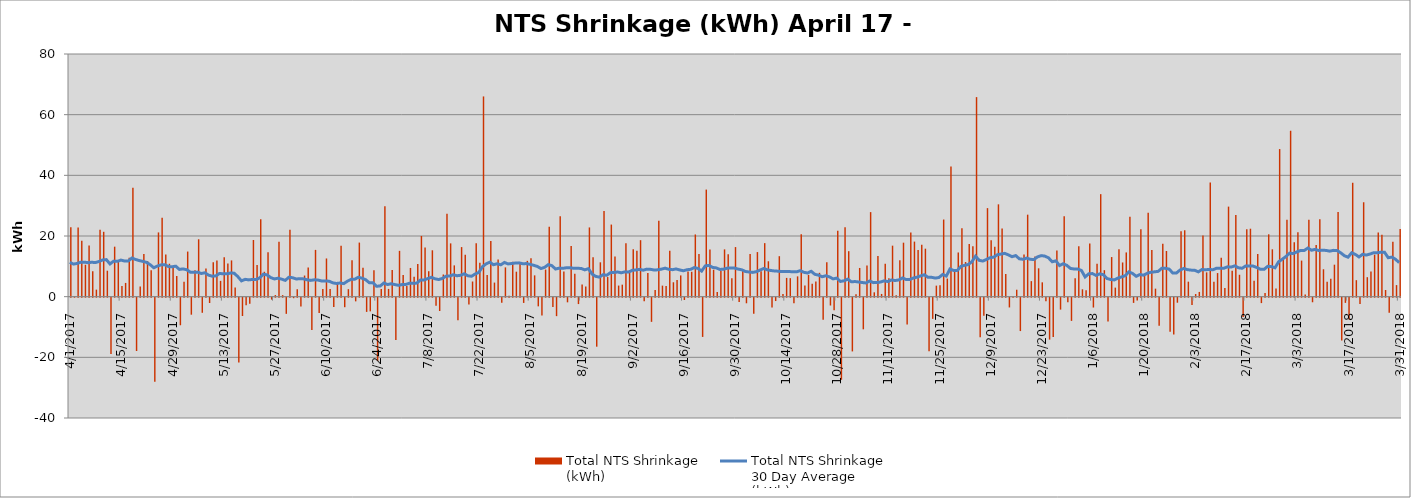
| Category | Total NTS Shrinkage
(kWh) |
|---|---|
| 4/1/17 | 22899211 |
| 4/2/17 | 31571 |
| 4/3/17 | 22828345 |
| 4/4/17 | 18425044 |
| 4/5/17 | 10522589 |
| 4/6/17 | 16871160 |
| 4/7/17 | 8370533 |
| 4/8/17 | 2317661 |
| 4/9/17 | 22088375 |
| 4/10/17 | 21384780 |
| 4/11/17 | 8561859 |
| 4/12/17 | -18567308 |
| 4/13/17 | 16483180 |
| 4/14/17 | 11553594 |
| 4/15/17 | 3481130 |
| 4/16/17 | 4533171 |
| 4/17/17 | 12822129 |
| 4/18/17 | 35867719 |
| 4/19/17 | -17578336 |
| 4/20/17 | 3348973 |
| 4/21/17 | 14102287 |
| 4/22/17 | 11722019 |
| 4/23/17 | 8715219 |
| 4/24/17 | -27752166 |
| 4/25/17 | 21179515 |
| 4/26/17 | 26007398 |
| 4/27/17 | 13905527 |
| 4/28/17 | 10853023 |
| 4/29/17 | 9789022 |
| 4/30/17 | 6830050 |
| 5/1/17 | -9097026 |
| 5/2/17 | 4910634 |
| 5/3/17 | 14871410 |
| 5/4/17 | -5611143 |
| 5/5/17 | 8714971 |
| 5/6/17 | 18920007 |
| 5/7/17 | -4984629 |
| 5/8/17 | 9303245 |
| 5/9/17 | -1756342 |
| 5/10/17 | 11345952 |
| 5/11/17 | 11882661 |
| 5/12/17 | 5202563 |
| 5/13/17 | 13001341 |
| 5/14/17 | 10920946 |
| 5/15/17 | 11953606 |
| 5/16/17 | 3000865 |
| 5/17/17 | -21412207 |
| 5/18/17 | -6044130 |
| 5/19/17 | -2516443 |
| 5/20/17 | -1986275 |
| 5/21/17 | 18673705 |
| 5/22/17 | 10428705 |
| 5/23/17 | 25526680 |
| 5/24/17 | 8207004 |
| 5/25/17 | 14620090 |
| 5/26/17 | -637089 |
| 5/27/17 | 523262 |
| 5/28/17 | 18130890 |
| 5/29/17 | 506692 |
| 5/30/17 | -5335309 |
| 5/31/17 | 22044772 |
| 6/1/17 | -177895 |
| 6/2/17 | 2454512 |
| 6/3/17 | -2891870 |
| 6/4/17 | 6962867 |
| 6/5/17 | 9646195 |
| 6/6/17 | -10692787 |
| 6/7/17 | 15426511 |
| 6/8/17 | -5042109 |
| 6/9/17 | 2535399 |
| 6/10/17 | 12594384 |
| 6/11/17 | 2541702 |
| 6/12/17 | -3098470 |
| 6/13/17 | 4503715 |
| 6/14/17 | 16817905 |
| 6/15/17 | -3146412 |
| 6/16/17 | 2472450 |
| 6/17/17 | 11986159 |
| 6/18/17 | -1218060 |
| 6/19/17 | 17832073 |
| 6/20/17 | 9529644 |
| 6/21/17 | -4692536 |
| 6/22/17 | -4517886 |
| 6/23/17 | 8713087 |
| 6/24/17 | -20828990 |
| 6/25/17 | 2486416 |
| 6/26/17 | 29834194 |
| 6/27/17 | 2555009 |
| 6/28/17 | 8831528 |
| 6/29/17 | -13945696 |
| 6/30/17 | 15104091 |
| 7/1/17 | 7162171 |
| 7/2/17 | 3494645 |
| 7/3/17 | 9463736 |
| 7/4/17 | 6580677 |
| 7/5/17 | 10736020 |
| 7/6/17 | 20013828 |
| 7/7/17 | 16226937 |
| 7/8/17 | 8388916 |
| 7/9/17 | 15291304 |
| 7/10/17 | -2666343 |
| 7/11/17 | -4397938 |
| 7/12/17 | 7309100 |
| 7/13/17 | 27366353 |
| 7/14/17 | 17567824 |
| 7/15/17 | 10315699 |
| 7/16/17 | -7461649 |
| 7/17/17 | 16348762 |
| 7/18/17 | 13812211 |
| 7/19/17 | -2225502 |
| 7/20/17 | 4998752 |
| 7/21/17 | 17582174 |
| 7/22/17 | 11154321 |
| 7/23/17 | 66012244 |
| 7/24/17 | 7136433 |
| 7/25/17 | 18383983 |
| 7/26/17 | 4643234 |
| 7/27/17 | 12255858 |
| 7/28/17 | -1676090 |
| 7/29/17 | 9652182 |
| 7/30/17 | 280558 |
| 7/31/17 | 11496016 |
| 8/1/17 | 8234154 |
| 8/2/17 | 10958989 |
| 8/3/17 | -1733560 |
| 8/4/17 | 11801093 |
| 8/5/17 | 12669606 |
| 8/6/17 | 7022285 |
| 8/7/17 | -2860414 |
| 8/8/17 | -5893028 |
| 8/9/17 | 8933801 |
| 8/10/17 | 23014635 |
| 8/11/17 | -3078922 |
| 8/12/17 | -6092177 |
| 8/13/17 | 26546048 |
| 8/14/17 | 8256224 |
| 8/15/17 | -1537245 |
| 8/16/17 | 16693633 |
| 8/17/17 | 7570737 |
| 8/18/17 | -2112967 |
| 8/19/17 | 4050860 |
| 8/20/17 | 3316100 |
| 8/21/17 | 22823733 |
| 8/22/17 | 13016768 |
| 8/23/17 | -16160138 |
| 8/24/17 | 11325567 |
| 8/25/17 | 28238165 |
| 8/26/17 | 6469487 |
| 8/27/17 | 23769093 |
| 8/28/17 | 13270878 |
| 8/29/17 | 3660470 |
| 8/30/17 | 3956339 |
| 8/31/17 | 17584341 |
| 9/1/17 | 8711956 |
| 9/2/17 | 15668522 |
| 9/3/17 | 15140090 |
| 9/4/17 | 18623650 |
| 9/5/17 | -1197529 |
| 9/6/17 | 7789300 |
| 9/7/17 | -7970834 |
| 9/8/17 | 2204736 |
| 9/9/17 | 25018955 |
| 9/10/17 | 3637427 |
| 9/11/17 | 3543433 |
| 9/12/17 | 15163996 |
| 9/13/17 | 4744732 |
| 9/14/17 | 5513837 |
| 9/15/17 | 7005735 |
| 9/16/17 | -777897 |
| 9/17/17 | 8259079 |
| 9/18/17 | 8210216 |
| 9/19/17 | 20506306 |
| 9/20/17 | 14099793 |
| 9/21/17 | -12941470 |
| 9/22/17 | 35301162 |
| 9/23/17 | 15554092 |
| 9/24/17 | 8891937 |
| 9/25/17 | 1550892 |
| 9/26/17 | 8553285 |
| 9/27/17 | 15590772 |
| 9/28/17 | 13980984 |
| 9/29/17 | 6071819 |
| 9/30/17 | 16350753 |
| 10/1/17 | -1413151 |
| 10/2/17 | 8695314 |
| 10/3/17 | -1850134 |
| 10/4/17 | 14052235 |
| 10/5/17 | -5282946 |
| 10/6/17 | 14701270 |
| 10/7/17 | 8370518 |
| 10/8/17 | 17649905 |
| 10/9/17 | 11669533 |
| 10/10/17 | -3232342 |
| 10/11/17 | -1114439 |
| 10/12/17 | 13344609 |
| 10/13/17 | 893000 |
| 10/14/17 | 6186434 |
| 10/15/17 | 6102686 |
| 10/16/17 | -1840577 |
| 10/17/17 | 6691637 |
| 10/18/17 | 20587692 |
| 10/19/17 | 3657202 |
| 10/20/17 | 7170886 |
| 10/21/17 | 4246605 |
| 10/22/17 | 5010752 |
| 10/23/17 | 7865291 |
| 10/24/17 | -7300204 |
| 10/25/17 | 11326076 |
| 10/26/17 | -2584512 |
| 10/27/17 | -4140897 |
| 10/28/17 | 21763006 |
| 10/29/17 | -27060230 |
| 10/30/17 | 22866636 |
| 10/31/17 | 14995051 |
| 11/1/17 | -17720301 |
| 11/2/17 | 799185 |
| 11/3/17 | 9462596 |
| 11/4/17 | -10434844 |
| 11/5/17 | 10259229 |
| 11/6/17 | 27875288 |
| 11/7/17 | 1437739 |
| 11/8/17 | 13388899 |
| 11/9/17 | 895461 |
| 11/10/17 | 10862103 |
| 11/11/17 | 6034390 |
| 11/12/17 | 16814394 |
| 11/13/17 | 507887 |
| 11/14/17 | 12026645 |
| 11/15/17 | 17798476 |
| 11/16/17 | -8862980 |
| 11/17/17 | 21155045 |
| 11/18/17 | 18153059 |
| 11/19/17 | 15405912 |
| 11/20/17 | 17074375 |
| 11/21/17 | 15822649 |
| 11/22/17 | -17656151 |
| 11/23/17 | -6989250 |
| 11/24/17 | 3636267 |
| 11/25/17 | 3773154 |
| 11/26/17 | 25434187 |
| 11/27/17 | 5971936 |
| 11/28/17 | 42908912 |
| 11/29/17 | 8594845 |
| 11/30/17 | 14568116 |
| 12/1/17 | 22571650 |
| 12/2/17 | 11416166 |
| 12/3/17 | 17327671 |
| 12/4/17 | 16643883 |
| 12/5/17 | 65786347 |
| 12/6/17 | -13010937 |
| 12/7/17 | -5937147 |
| 12/8/17 | 29189548 |
| 12/9/17 | 18564377 |
| 12/10/17 | 16493418 |
| 12/11/17 | 30441252 |
| 12/12/17 | 22509817 |
| 12/13/17 | 7436906 |
| 12/14/17 | -3224056 |
| 12/15/17 | 76381 |
| 12/16/17 | 2291803 |
| 12/17/17 | -11013071 |
| 12/18/17 | 13918869 |
| 12/19/17 | 27035501 |
| 12/20/17 | 5121324 |
| 12/21/17 | 13217479 |
| 12/22/17 | 9348393 |
| 12/23/17 | 4726951 |
| 12/24/17 | -1154185 |
| 12/25/17 | -13824626 |
| 12/26/17 | -12949911 |
| 12/27/17 | 15252536 |
| 12/28/17 | -3938289 |
| 12/29/17 | 26540245 |
| 12/30/17 | -1485635 |
| 12/31/17 | -7656364 |
| 1/1/18 | 6092274 |
| 1/2/18 | 16605932 |
| 1/3/18 | 2434947 |
| 1/4/18 | 2152706 |
| 1/5/18 | 17551021 |
| 1/6/18 | -3251707 |
| 1/7/18 | 10874256 |
| 1/8/18 | 33797112 |
| 1/9/18 | 8731070 |
| 1/10/18 | -7865515 |
| 1/11/18 | 13061351 |
| 1/12/18 | 2985014 |
| 1/13/18 | 15611844 |
| 1/14/18 | 11274936 |
| 1/15/18 | 14587413 |
| 1/16/18 | 26355626 |
| 1/17/18 | -1721968 |
| 1/18/18 | -909324 |
| 1/19/18 | 22238489 |
| 1/20/18 | 7214941 |
| 1/21/18 | 27691864 |
| 1/22/18 | 15399172 |
| 1/23/18 | 2642925 |
| 1/24/18 | -9241930 |
| 1/25/18 | 17443690 |
| 1/26/18 | 15053370 |
| 1/27/18 | -11264732 |
| 1/28/18 | -12140056 |
| 1/29/18 | -1664316 |
| 1/30/18 | 21551877 |
| 1/31/18 | 21892852 |
| 2/1/18 | 4947190 |
| 2/2/18 | -2448027 |
| 2/3/18 | 865560 |
| 2/4/18 | 1561777 |
| 2/5/18 | 20132709 |
| 2/6/18 | 8015695 |
| 2/7/18 | 37653043 |
| 2/8/18 | 4894467 |
| 2/9/18 | 7781499 |
| 2/10/18 | 12798664 |
| 2/11/18 | 2897013 |
| 2/12/18 | 29687127 |
| 2/13/18 | 8573872 |
| 2/14/18 | 26886285 |
| 2/15/18 | 7221939 |
| 2/16/18 | -6363680 |
| 2/17/18 | 22221788 |
| 2/18/18 | 22404318 |
| 2/19/18 | 5213725 |
| 2/20/18 | 14030162 |
| 2/21/18 | -1789661 |
| 2/22/18 | 1201423 |
| 2/23/18 | 20561669 |
| 2/24/18 | 15611459 |
| 2/25/18 | 2723266 |
| 2/26/18 | 48656133 |
| 2/27/18 | 12462217 |
| 2/28/18 | 25357373 |
| 3/1/18 | 54698757 |
| 3/2/18 | 17964383 |
| 3/3/18 | 21218065 |
| 3/4/18 | 11892789 |
| 3/5/18 | 713171 |
| 3/6/18 | 25348643 |
| 3/7/18 | -1514329 |
| 3/8/18 | 16992728 |
| 3/9/18 | 25491299 |
| 3/10/18 | 9039007 |
| 3/11/18 | 4934908 |
| 3/12/18 | 5941788 |
| 3/13/18 | 10545006 |
| 3/14/18 | 27946724 |
| 3/15/18 | -14161224 |
| 3/16/18 | -1713429 |
| 3/17/18 | -7187952 |
| 3/18/18 | 37552732 |
| 3/19/18 | 5439861 |
| 3/20/18 | -2111357 |
| 3/21/18 | 31125202 |
| 3/22/18 | 6425003 |
| 3/23/18 | 8324308 |
| 3/24/18 | 13851801 |
| 3/25/18 | 21180606 |
| 3/26/18 | 20415543 |
| 3/27/18 | 2204836 |
| 3/28/18 | -4942357 |
| 3/29/18 | 18101803 |
| 3/30/18 | 3814743 |
| 3/31/18 | 22340338 |